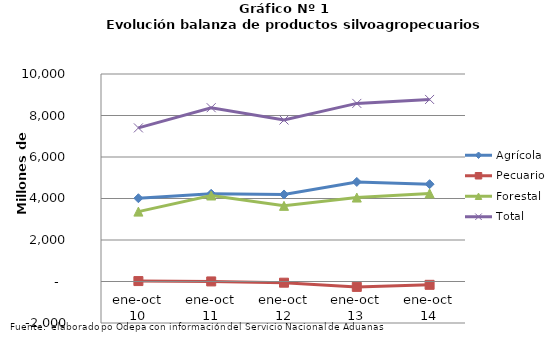
| Category | Agrícola | Pecuario | Forestal | Total |
|---|---|---|---|---|
| ene-oct 10 | 4013542 | 20954 | 3368023 | 7402519 |
| ene-oct 11 | 4227754 | 3516 | 4144678 | 8375948 |
| ene-oct 12 | 4194643 | -57976 | 3645992 | 7782659 |
| ene-oct 13 | 4797936 | -260439 | 4045785 | 8583282 |
| ene-oct 14 | 4689899 | -159926 | 4243680 | 8773653 |